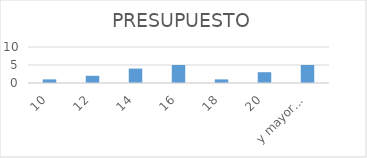
| Category | Frecuencia |
|---|---|
| 10 | 1 |
| 12 | 2 |
| 14 | 4 |
| 16 | 5 |
| 18 | 1 |
| 20 | 3 |
| y mayor... | 5 |